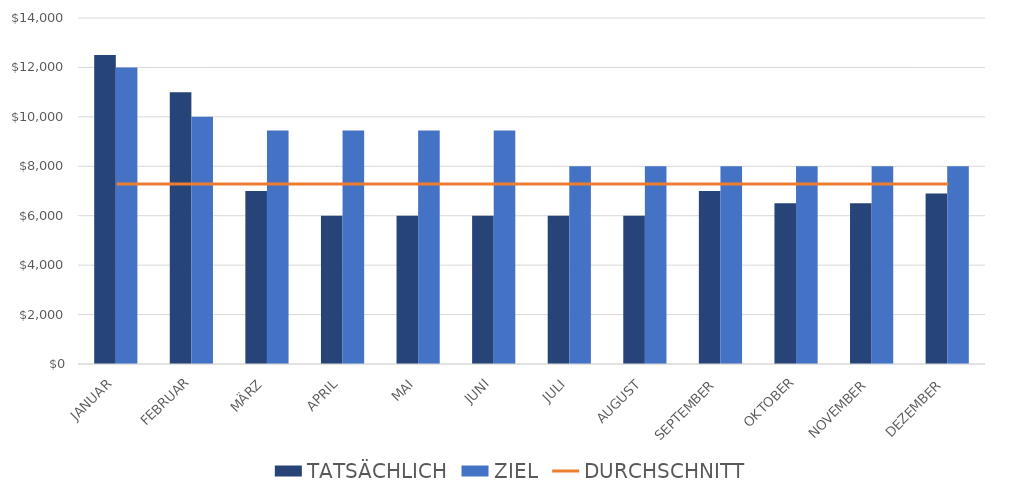
| Category | TATSÄCHLICH | ZIEL |
|---|---|---|
| JANUAR | 12500 | 12000 |
| FEBRUAR | 11000 | 10000 |
| MÄRZ | 7000 | 9450 |
| APRIL | 6000 | 9450 |
| MAI | 6000 | 9450 |
| JUNI | 6000 | 9450 |
| JULI | 6000 | 8000 |
| AUGUST | 6000 | 8000 |
| SEPTEMBER | 7000 | 8000 |
| OKTOBER | 6500 | 8000 |
| NOVEMBER | 6500 | 8000 |
| DEZEMBER | 6900 | 8000 |